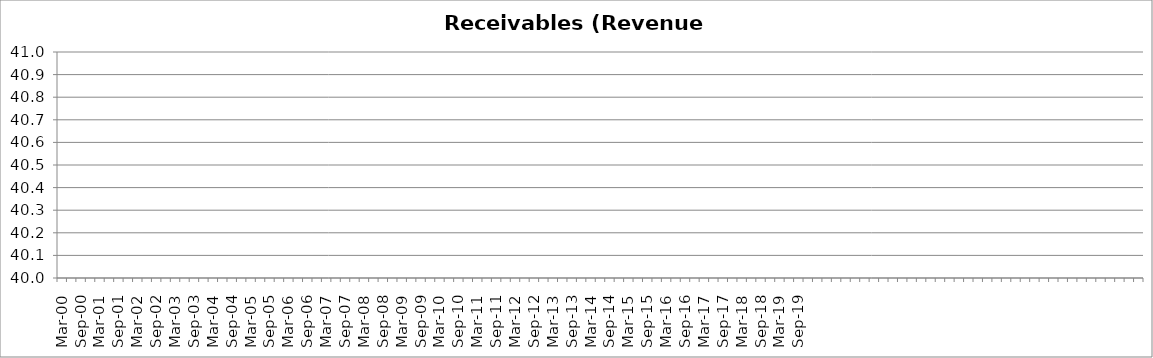
| Category | Receivables (Revenue Days) |
|---|---|
| Mar-00 | 8.199 |
| Jun-00 | 7.174 |
| Sep-00 | 7.91 |
| Dec-00 | 9.603 |
| Mar-01 | 8.607 |
| Jun-01 | 8.724 |
| Sep-01 | 7.975 |
| Dec-01 | 8.918 |
| Mar-02 | 8.8 |
| Jun-02 | 9.371 |
| Sep-02 | 9.893 |
| Dec-02 | 10.012 |
| Mar-03 | 9.275 |
| Jun-03 | 9.31 |
| Sep-03 | 8.816 |
| Dec-03 | 9.162 |
| Mar-04 | 7.958 |
| Jun-04 | 7.578 |
| Sep-04 | 7.831 |
| Dec-04 | 7.54 |
| Mar-05 | 8.752 |
| Jun-05 | 8.24 |
| Sep-05 | 7.647 |
| Dec-05 | 8.405 |
| Mar-06 | 8.059 |
| Jun-06 | 8.473 |
| Sep-06 | 8.263 |
| Dec-06 | 8.84 |
| Mar-07 | 7.768 |
| Jun-07 | 7.403 |
| Sep-07 | 9.178 |
| Dec-07 | 9.109 |
| Mar-08 | 8.064 |
| Jun-08 | 8.139 |
| Sep-08 | 7.42 |
| Dec-08 | 6.828 |
| Mar-09 | 6.068 |
| Jun-09 | 6.523 |
| Sep-09 | 6.17 |
| Dec-09 | 7.541 |
| Mar-10 | 7.264 |
| Jun-10 | 7.224 |
| Sep-10 | 7.356 |
| Dec-10 | 7.674 |
| Mar-11 | 7.172 |
| Jun-11 | 7.188 |
| Sep-11 | 6.619 |
| Dec-11 | 7.378 |
| Mar-12 | 6.94 |
| Jun-12 | 6.885 |
| Sep-12 | 7.566 |
| Dec-12 | 11.327 |
| Mar-13 | 8.785 |
| Jun-13 | 7.62 |
| Sep-13 | 8.247 |
| Dec-13 | 10.968 |
| Mar-14 | 9.461 |
| Jun-14 | 9.433 |
| Sep-14 | 9.374 |
| Dec-14 | 10.809 |
| Mar-15 | 9.609 |
| Jun-15 | 10.058 |
| Sep-15 | 9.924 |
| Dec-15 | 10.705 |
| Mar-16 | 14.602 |
| Jun-16 | 14.62 |
| Sep-16 | 15.314 |
| Dec-16 | 12.535 |
| Mar-17 | 13.389 |
| Jun-17 | 12.784 |
| Sep-17 | 15.916 |
| Dec-17 | 14.963 |
| Mar-18 | 14.568 |
| Jun-18 | 11.428 |
| Sep-18 | 11.721 |
| Dec-18 | 15.672 |
| Mar-19 | 6.891 |
| Jun-19 | 6.638 |
| Sep-19 | 7.299 |